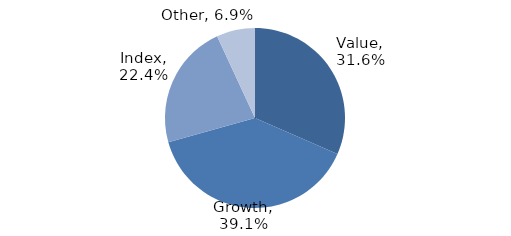
| Category | Investment Style |
|---|---|
| Value | 0.316 |
| Growth | 0.391 |
| Index | 0.224 |
| Other | 0.069 |